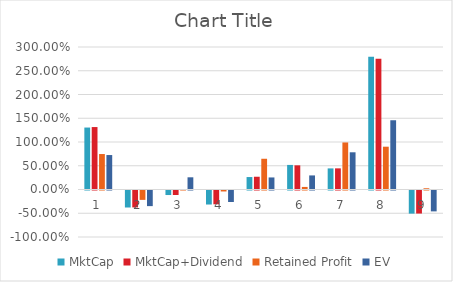
| Category | MktCap | MktCap+Dividend | Retained Profit | EV |
|---|---|---|---|---|
| 0 | 1.304 | 1.315 | 0.747 | 0.725 |
| 1 | -0.358 | -0.356 | -0.198 | -0.329 |
| 2 | -0.095 | -0.094 | 0.01 | 0.257 |
| 3 | -0.295 | -0.29 | -0.02 | -0.243 |
| 4 | 0.262 | 0.269 | 0.647 | 0.254 |
| 5 | 0.517 | 0.509 | 0.054 | 0.296 |
| 6 | 0.444 | 0.445 | 0.99 | 0.783 |
| 7 | 2.794 | 2.754 | 0.901 | 1.458 |
| 8 | -0.487 | -0.485 | 0.026 | -0.44 |